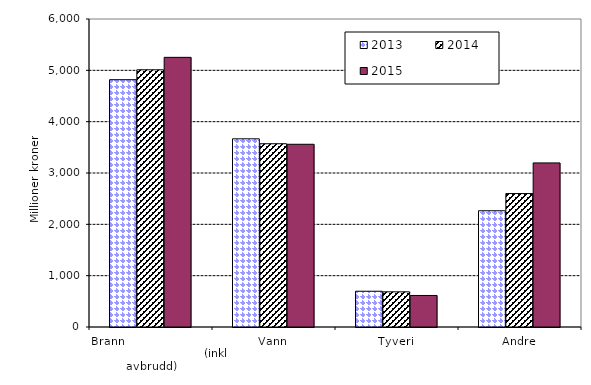
| Category | 2013 | 2014 | 2015 |
|---|---|---|---|
| Brann                                                       (inkl avbrudd) | 4817.943 | 5010.408 | 5253.019 |
| Vann | 3665.899 | 3569.905 | 3559.668 |
| Tyveri | 696.534 | 684.937 | 613.944 |
| Andre | 2264.482 | 2599.653 | 3196.442 |